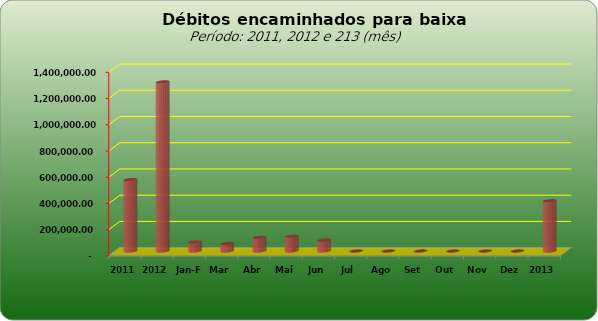
| Category |  543.796,20   1.288.982,12   68.983,48   57.649,63   103.629,52   112.546,24   82.743,05   -     -     -     -     -     -     383.361,27  |
|---|---|
| 2011 | 543796.2 |
| 2012 | 1288982.12 |
| Jan-Fev | 68983.48 |
| Mar | 57649.63 |
| Abr | 103629.52 |
| Mai | 112546.24 |
| Jun | 82743.05 |
| Jul | 0 |
| Ago | 0 |
| Set | 0 |
| Out | 0 |
| Nov | 0 |
| Dez | 0 |
| 2013 | 383361.27 |